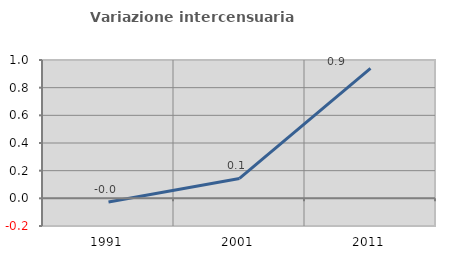
| Category | Variazione intercensuaria annua |
|---|---|
| 1991.0 | -0.027 |
| 2001.0 | 0.144 |
| 2011.0 | 0.939 |